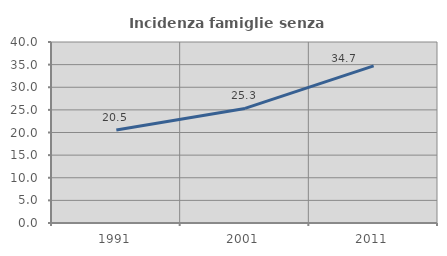
| Category | Incidenza famiglie senza nuclei |
|---|---|
| 1991.0 | 20.537 |
| 2001.0 | 25.318 |
| 2011.0 | 34.718 |